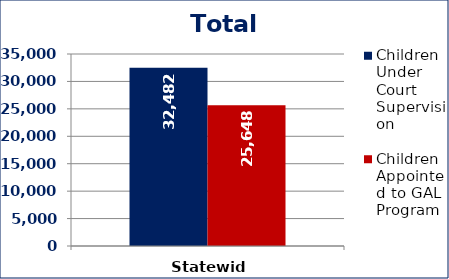
| Category | Children Under Court Supervision  | Children Appointed to GAL Program  |
|---|---|---|
| Statewide | 32482 | 25648 |